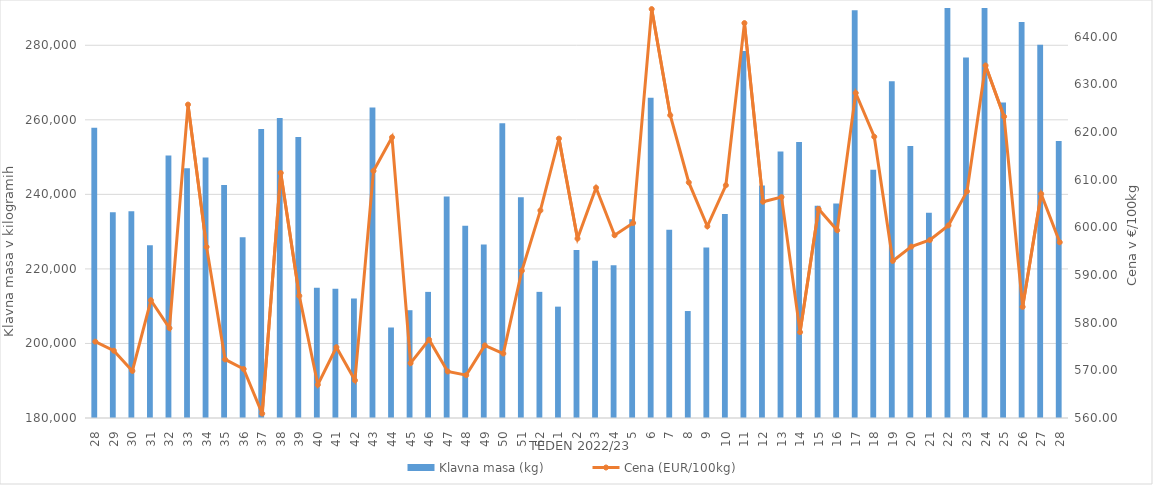
| Category | Klavna masa (kg) |
|---|---|
| 28.0 | 257905 |
| 29.0 | 235185 |
| 30.0 | 235475 |
| 31.0 | 226322 |
| 32.0 | 250418 |
| 33.0 | 246996 |
| 34.0 | 249873 |
| 35.0 | 242516 |
| 36.0 | 228469 |
| 37.0 | 257511 |
| 38.0 | 260481 |
| 39.0 | 255370 |
| 40.0 | 214936 |
| 41.0 | 214672 |
| 42.0 | 212066 |
| 43.0 | 263287 |
| 44.0 | 204280 |
| 45.0 | 208920 |
| 46.0 | 213836 |
| 47.0 | 239417 |
| 48.0 | 231565 |
| 49.0 | 226575 |
| 50.0 | 259073 |
| 51.0 | 239211 |
| 52.0 | 213841 |
| 1.0 | 209877 |
| 2.0 | 225045 |
| 3.0 | 222198 |
| 4.0 | 221002 |
| 5.0 | 233306 |
| 6.0 | 265944 |
| 7.0 | 230531 |
| 8.0 | 208699 |
| 9.0 | 225712 |
| 10.0 | 234762 |
| 11.0 | 278467 |
| 12.0 | 242369 |
| 13.0 | 251507 |
| 14.0 | 254072 |
| 15.0 | 236964 |
| 16.0 | 237552 |
| 17.0 | 289400 |
| 18.0 | 246616 |
| 19.0 | 270374 |
| 20.0 | 252984 |
| 21.0 | 235060 |
| 22.0 | 290816 |
| 23.0 | 276702 |
| 24.0 | 292976 |
| 25.0 | 264669 |
| 26.0 | 286237 |
| 27.0 | 280112 |
| 28.0 | 254336 |